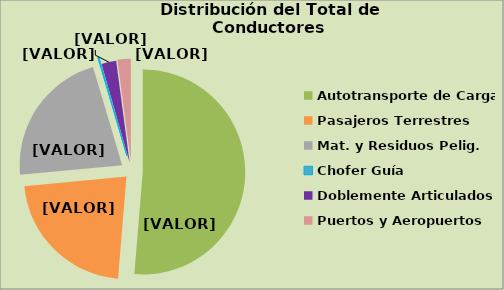
| Category | Series 0 |
|---|---|
| Autotransporte de Carga | 51.311 |
| Pasajeros Terrestres | 22.205 |
| Mat. y Residuos Pelig. | 21.899 |
| Chofer Guía | 0.172 |
| Doblemente Articulados | 2.316 |
| Puertos y Aeropuertos | 2.097 |